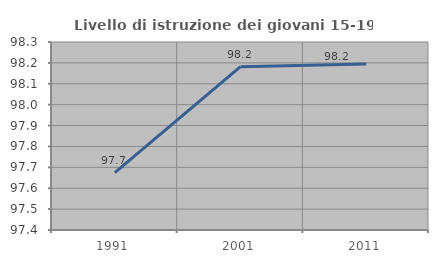
| Category | Livello di istruzione dei giovani 15-19 anni |
|---|---|
| 1991.0 | 97.674 |
| 2001.0 | 98.182 |
| 2011.0 | 98.195 |